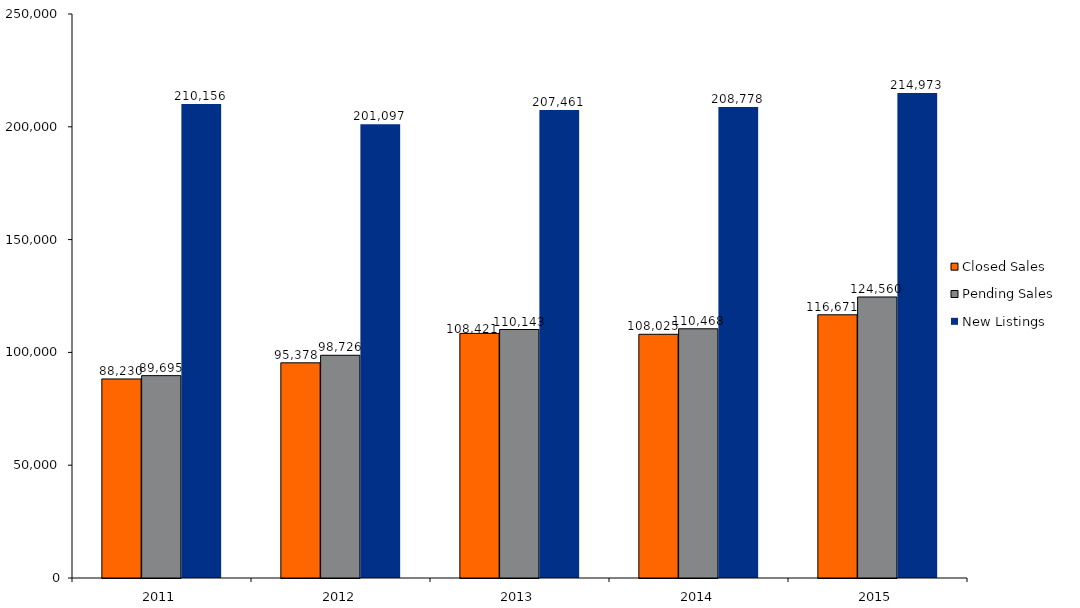
| Category | Closed Sales | Pending Sales | New Listings |
|---|---|---|---|
| 2011.0 | 88230 | 89695 | 210156 |
| 2012.0 | 95378 | 98726 | 201097 |
| 2013.0 | 108421 | 110143 | 207461 |
| 2014.0 | 108025 | 110468 | 208778 |
| 2015.0 | 116671 | 124560 | 214973 |